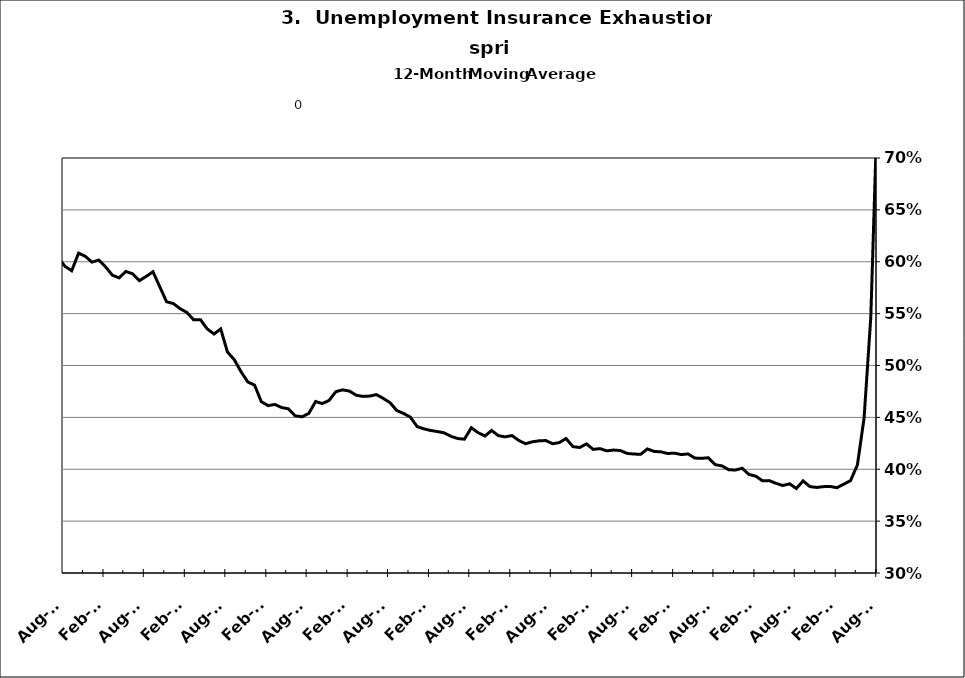
| Category | Series 0 |
|---|---|
| 2002-12-31 | 0.428 |
| 2003-01-31 | 0.432 |
| 2003-02-28 | 0.437 |
| 2003-03-31 | 0.445 |
| 2003-04-30 | 0.455 |
| 2003-05-31 | 0.466 |
| 2003-06-30 | 0.475 |
| 2003-07-31 | 0.485 |
| 2003-08-31 | 0.499 |
| 2003-09-30 | 0.502 |
| 2003-10-31 | 0.5 |
| 2003-11-30 | 0.506 |
| 2003-12-31 | 0.505 |
| 2004-01-31 | 0.505 |
| 2004-02-29 | 0.507 |
| 2004-03-31 | 0.501 |
| 2004-04-30 | 0.491 |
| 2004-05-31 | 0.486 |
| 2004-06-30 | 0.477 |
| 2004-07-31 | 0.466 |
| 2004-08-31 | 0.464 |
| 2004-09-30 | 0.452 |
| 2004-10-31 | 0.448 |
| 2004-11-30 | 0.44 |
| 2004-12-31 | 0.429 |
| 2005-01-31 | 0.429 |
| 2005-02-28 | 0.418 |
| 2005-03-31 | 0.412 |
| 2005-04-30 | 0.409 |
| 2005-05-31 | 0.404 |
| 2005-06-30 | 0.398 |
| 2005-07-31 | 0.4 |
| 2005-08-31 | 0.398 |
| 2005-09-30 | 0.398 |
| 2005-10-31 | 0.398 |
| 2005-11-30 | 0.392 |
| 2005-12-31 | 0.391 |
| 2006-01-31 | 0.388 |
| 2006-02-28 | 0.385 |
| 2006-03-31 | 0.381 |
| 2006-04-30 | 0.383 |
| 2006-05-31 | 0.387 |
| 2006-06-30 | 0.387 |
| 2006-07-31 | 0.393 |
| 2006-08-31 | 0.401 |
| 2006-09-30 | 0.415 |
| 2006-10-31 | 0.422 |
| 2006-11-30 | 0.423 |
| 2006-12-31 | 0.427 |
| 2007-01-31 | 0.425 |
| 2007-02-28 | 0.427 |
| 2007-03-31 | 0.431 |
| 2007-04-30 | 0.437 |
| 2007-05-31 | 0.434 |
| 2007-06-30 | 0.436 |
| 2007-07-30 | 0.443 |
| 2007-08-31 | 0.435 |
| 2007-09-30 | 0.437 |
| 2007-10-31 | 0.433 |
| 2007-11-15 | 0.438 |
| 2007-12-15 09:36:00 | 0.446 |
| 2008-01-14 19:12:00 | 0.447 |
| 2008-02-14 04:48:00 | 0.455 |
| 2008-03-15 14:24:00 | 0.462 |
| 2008-04-15 | 0.462 |
| 2008-05-15 09:36:00 | 0.467 |
| 2008-06-14 19:12:00 | 0.475 |
| 2008-07-15 04:48:00 | 0.47 |
| 2008-08-14 14:24:00 | 0.469 |
| 2008-09-14 | 0.473 |
| 2008-10-14 09:36:00 | 0.478 |
| 2008-11-13 19:12:00 | 0.489 |
| 2008-12-14 04:48:00 | 0.497 |
| 2009-01-13 14:24:00 | 0.51 |
| 2009-02-13 | 0.528 |
| 2009-03-15 09:36:00 | 0.547 |
| 2009-04-14 19:12:00 | 0.565 |
| 2009-05-15 04:48:00 | 0.582 |
| 2009-06-14 14:24:00 | 0.6 |
| 2009-07-15 | 0.611 |
| 2009-08-14 09:36:00 | 0.631 |
| 2009-09-13 19:12:00 | 0.623 |
| 2009-10-14 04:48:00 | 0.631 |
| 2009-11-13 14:24:00 | 0.65 |
| 2009-12-14 | 0.65 |
| 2010-01-13 09:36:00 | 0.657 |
| 2010-02-12 19:12:00 | 0.652 |
| 2010-03-15 04:48:00 | 0.649 |
| 2010-04-14 14:24:00 | 0.636 |
| 2010-05-15 | 0.623 |
| 2010-06-14 09:36:00 | 0.615 |
| 2010-07-14 19:12:00 | 0.604 |
| 2010-08-14 04:48:00 | 0.596 |
| 2010-09-13 14:24:00 | 0.591 |
| 2010-10-14 | 0.608 |
| 2010-11-13 09:36:00 | 0.605 |
| 2010-12-13 19:12:00 | 0.6 |
| 2011-01-13 04:48:00 | 0.602 |
| 2011-02-12 14:24:00 | 0.595 |
| 2011-03-15 | 0.587 |
| 2011-04-14 09:36:00 | 0.584 |
| 2011-05-14 19:12:00 | 0.591 |
| 2011-06-14 04:48:00 | 0.588 |
| 2011-07-14 14:24:00 | 0.582 |
| 2011-08-14 | 0.586 |
| 2011-09-13 09:36:00 | 0.59 |
| 2011-10-13 19:12:00 | 0.576 |
| 2011-11-13 04:48:00 | 0.561 |
| 2011-12-13 14:24:00 | 0.56 |
| 2012-01-13 | 0.555 |
| 2012-02-12 09:36:00 | 0.551 |
| 2012-03-13 19:12:00 | 0.544 |
| 2012-04-13 04:48:00 | 0.544 |
| 2012-05-13 14:24:00 | 0.535 |
| 2012-06-13 | 0.53 |
| 2012-07-13 09:36:00 | 0.535 |
| 2012-08-12 19:12:00 | 0.513 |
| 2012-09-12 04:48:00 | 0.506 |
| 2012-10-12 14:24:00 | 0.494 |
| 2012-11-12 | 0.484 |
| 2012-12-12 09:36:00 | 0.481 |
| 2013-01-11 19:12:00 | 0.465 |
| 2013-02-11 04:48:00 | 0.461 |
| 2013-03-13 14:24:00 | 0.462 |
| 2013-04-13 | 0.459 |
| 2013-05-13 09:36:00 | 0.458 |
| 2013-06-12 19:12:00 | 0.452 |
| 2013-07-13 04:48:00 | 0.451 |
| 2013-08-12 14:24:00 | 0.454 |
| 2013-09-12 | 0.465 |
| 2013-10-12 09:36:00 | 0.463 |
| 2013-11-11 19:12:00 | 0.466 |
| 2013-12-12 04:48:00 | 0.475 |
| 2014-01-11 14:24:00 | 0.477 |
| 2014-02-11 | 0.475 |
| 2014-03-13 09:36:00 | 0.471 |
| 2014-04-12 19:12:00 | 0.47 |
| 2014-05-13 04:48:00 | 0.471 |
| 2014-06-12 14:24:00 | 0.472 |
| 2014-07-13 | 0.468 |
| 2014-08-12 09:36:00 | 0.464 |
| 2014-09-11 19:12:00 | 0.457 |
| 2014-10-12 04:48:00 | 0.454 |
| 2014-11-11 14:24:00 | 0.45 |
| 2014-12-12 | 0.441 |
| 2015-01-11 09:36:00 | 0.439 |
| 2015-02-10 19:12:00 | 0.437 |
| 2015-03-13 04:48:00 | 0.436 |
| 2015-04-12 14:24:00 | 0.435 |
| 2015-05-13 | 0.432 |
| 2015-06-12 09:36:00 | 0.43 |
| 2015-07-12 19:12:00 | 0.429 |
| 2015-08-12 04:48:00 | 0.44 |
| 2015-09-11 14:24:00 | 0.435 |
| 2015-10-12 | 0.432 |
| 2015-11-11 09:36:00 | 0.437 |
| 2015-12-11 19:12:00 | 0.432 |
| 2016-01-11 04:48:00 | 0.431 |
| 2016-02-10 14:24:00 | 0.432 |
| 2016-03-12 | 0.428 |
| 2016-04-11 09:36:00 | 0.425 |
| 2016-05-11 19:12:00 | 0.426 |
| 2016-06-11 04:48:00 | 0.427 |
| 2016-07-11 14:24:00 | 0.428 |
| 2016-08-11 | 0.425 |
| 2016-09-10 09:36:00 | 0.426 |
| 2016-10-10 19:12:00 | 0.43 |
| 2016-11-10 04:48:00 | 0.422 |
| 2016-12-10 14:24:00 | 0.421 |
| 2017-01-10 | 0.424 |
| 2017-02-09 09:36:00 | 0.419 |
| 2017-03-11 19:12:00 | 0.42 |
| 2017-04-11 04:48:00 | 0.418 |
| 2017-05-11 14:24:00 | 0.418 |
| 2017-06-11 | 0.418 |
| 2017-07-11 09:36:00 | 0.415 |
| 2017-08-10 19:12:00 | 0.415 |
| 2017-09-10 04:48:00 | 0.414 |
| 2017-10-10 14:24:00 | 0.42 |
| 2017-11-10 | 0.417 |
| 2017-12-10 09:36:00 | 0.417 |
| 2018-01-09 19:12:00 | 0.415 |
| 2018-02-09 04:48:00 | 0.416 |
| 2018-03-11 14:24:00 | 0.414 |
| 2018-04-11 | 0.415 |
| 2018-05-11 09:36:00 | 0.411 |
| 2018-06-10 19:12:00 | 0.41 |
| 2018-07-11 04:48:00 | 0.411 |
| 2018-08-10 14:24:00 | 0.404 |
| 2018-09-10 | 0.403 |
| 2018-10-10 09:36:00 | 0.4 |
| 2018-11-09 19:12:00 | 0.399 |
| 2018-12-10 04:48:00 | 0.401 |
| 2019-01-09 14:24:00 | 0.395 |
| 2019-02-09 | 0.393 |
| 2019-03-11 09:36:00 | 0.389 |
| 2019-04-10 19:12:00 | 0.389 |
| 2019-05-11 04:48:00 | 0.386 |
| 2019-06-10 14:24:00 | 0.384 |
| 2019-07-11 | 0.386 |
| 2019-08-10 09:36:00 | 0.381 |
| 2019-09-09 19:12:00 | 0.389 |
| 2019-10-10 04:48:00 | 0.383 |
| 2019-11-09 14:24:00 | 0.382 |
| 2019-12-10 | 0.383 |
| 2020-01-09 09:36:00 | 0.383 |
| 2020-02-08 19:12:00 | 0.382 |
| 2020-03-10 04:48:00 | 0.386 |
| 2020-04-09 14:24:00 | 0.389 |
| 2020-05-10 | 0.404 |
| 2020-06-09 09:36:00 | 0.449 |
| 2020-07-09 19:12:00 | 0.546 |
| 2020-08-09 04:48:00 | 0.76 |